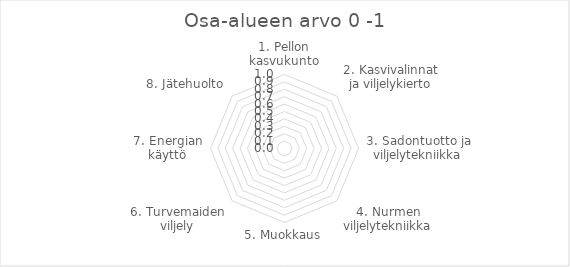
| Category | Indeksi |
|---|---|
| 1. Pellon kasvukunto | 0 |
| 2. Kasvivalinnat ja viljelykierto | 0 |
| 3. Sadontuotto ja viljelytekniikka | 0 |
| 4. Nurmen viljelytekniikka | 0 |
| 5. Muokkaus | 0 |
| 6. Turvemaiden viljely | 0 |
| 7. Energian käyttö | 0 |
| 8. Jätehuolto | 0 |